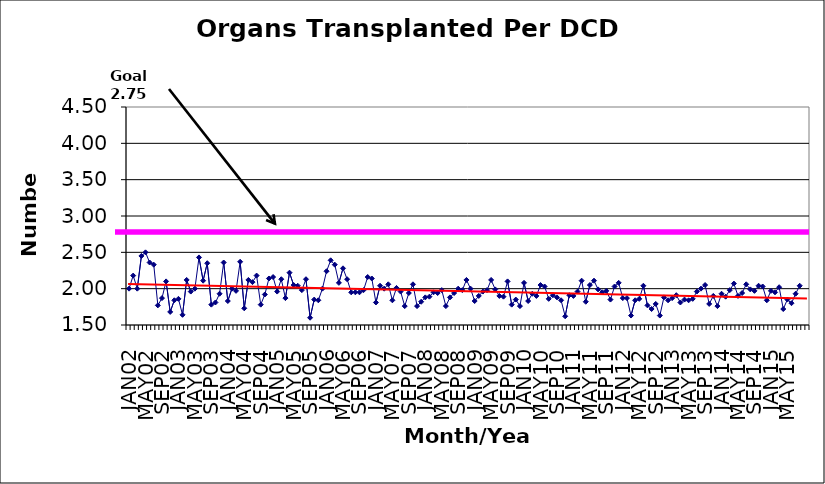
| Category | Series 0 |
|---|---|
| JAN02 | 2 |
| FEB02 | 2.18 |
| MAR02 | 2 |
| APR02 | 2.45 |
| MAY02 | 2.5 |
| JUN02 | 2.36 |
| JUL02 | 2.33 |
| AUG02 | 1.77 |
| SEP02 | 1.87 |
| OCT02 | 2.1 |
| NOV02 | 1.68 |
| DEC02 | 1.84 |
| JAN03 | 1.86 |
| FEB03 | 1.64 |
| MAR03 | 2.12 |
| APR03 | 1.96 |
| MAY03 | 2 |
| JUN03 | 2.43 |
| JUL03 | 2.11 |
| AUG03 | 2.35 |
| SEP03 | 1.78 |
| OCT03 | 1.81 |
| NOV03 | 1.93 |
| DEC03 | 2.36 |
| JAN04 | 1.83 |
| FEB04 | 2 |
| MAR04 | 1.97 |
| APR04 | 2.37 |
| MAY04 | 1.73 |
| JUN04 | 2.12 |
| JUL04 | 2.09 |
| AUG04 | 2.18 |
| SEP04 | 1.78 |
| OCT04 | 1.92 |
| NOV04 | 2.14 |
| DEC04 | 2.16 |
| JAN05 | 1.96 |
| FEB05 | 2.13 |
| MAR05 | 1.87 |
| APR05 | 2.22 |
| MAY05 | 2.05 |
| JUN05 | 2.04 |
| JUL05 | 1.98 |
| AUG05 | 2.13 |
| SEP05 | 1.6 |
| OCT05 | 1.85 |
| NOV05 | 1.84 |
| DEC05 | 2 |
| JAN06 | 2.24 |
| FEB06 | 2.39 |
| MAR06 | 2.33 |
| APR06 | 2.08 |
| MAY06 | 2.28 |
| JUN06 | 2.13 |
| JUL06 | 1.95 |
| AUG06 | 1.95 |
| SEP06 | 1.95 |
| OCT06 | 1.98 |
| NOV06 | 2.16 |
| DEC06 | 2.14 |
| JAN07 | 1.81 |
| FEB07 | 2.04 |
| MAR07 | 2 |
| APR07 | 2.06 |
| MAY07 | 1.84 |
| JUN07 | 2.01 |
| JUL07 | 1.96 |
| AUG07 | 1.76 |
| SEP07 | 1.94 |
| OCT07 | 2.06 |
| NOV07 | 1.76 |
| DEC07 | 1.82 |
| JAN08 | 1.88 |
| FEB08 | 1.89 |
| MAR08 | 1.95 |
| APR08 | 1.94 |
| MAY08 | 1.98 |
| JUN08 | 1.76 |
| JUL08 | 1.88 |
| AUG08 | 1.94 |
| SEP08 | 2 |
| OCT08 | 1.98 |
| NOV08 | 2.12 |
| DEC08 | 2 |
| JAN09 | 1.83 |
| FEB09 | 1.9 |
| MAR09 | 1.96 |
| APR09 | 1.98 |
| MAY09 | 2.12 |
| JUN09 | 1.99 |
| JUL09 | 1.9 |
| AUG09 | 1.89 |
| SEP09 | 2.1 |
| OCT09 | 1.78 |
| NOV09 | 1.85 |
| DEC09 | 1.76 |
| JAN10 | 2.08 |
| FEB10 | 1.83 |
| MAR10 | 1.93 |
| APR10 | 1.9 |
| MAY10 | 2.05 |
| JUN10 | 2.03 |
| JUL10 | 1.86 |
| AUG10 | 1.91 |
| SEP10 | 1.88 |
| OCT10 | 1.84 |
| NOV10 | 1.62 |
| DEC10 | 1.91 |
| JAN11 | 1.9 |
| FEB11 | 1.96 |
| MAR11 | 2.11 |
| APR11 | 1.82 |
| MAY11 | 2.05 |
| JUN11 | 2.11 |
| JUL11 | 1.99 |
| AUG11 | 1.95 |
| SEP11 | 1.97 |
| OCT11 | 1.85 |
| NOV11 | 2.03 |
| DEC11 | 2.08 |
| JAN12 | 1.87 |
| FEB12 | 1.87 |
| MAR12 | 1.63 |
| APR12 | 1.84 |
| MAY12 | 1.86 |
| JUN12 | 2.04 |
| JUL12 | 1.77 |
| AUG12 | 1.72 |
| SEP12 | 1.79 |
| OCT12 | 1.63 |
| NOV12 | 1.88 |
| DEC12 | 1.84 |
| JAN13 | 1.87 |
| FEB13 | 1.91 |
| MAR13 | 1.81 |
| APR13 | 1.85 |
| MAY13 | 1.84 |
| JUN13 | 1.86 |
| JUL13 | 1.96 |
| AUG13 | 2 |
| SEP13 | 2.05 |
| OCT13 | 1.79 |
| NOV13 | 1.9 |
| DEC13 | 1.76 |
| JAN14 | 1.93 |
| FEB14 | 1.89 |
| MAR14 | 1.98 |
| APR14 | 2.07 |
| MAY14 | 1.9 |
| JUN14 | 1.94 |
| JUL14 | 2.06 |
| AUG14 | 1.99 |
| SEP14 | 1.97 |
| OCT14 | 2.04 |
| NOV14 | 2.03 |
| DEC14 | 1.84 |
| JAN15 | 1.97 |
| FEB15 | 1.95 |
| MAR15 | 2.02 |
| APR15 | 1.72 |
| MAY15 | 1.85 |
| JUN15 | 1.8 |
| JUL15 | 1.93 |
| AUG15 | 2.04 |